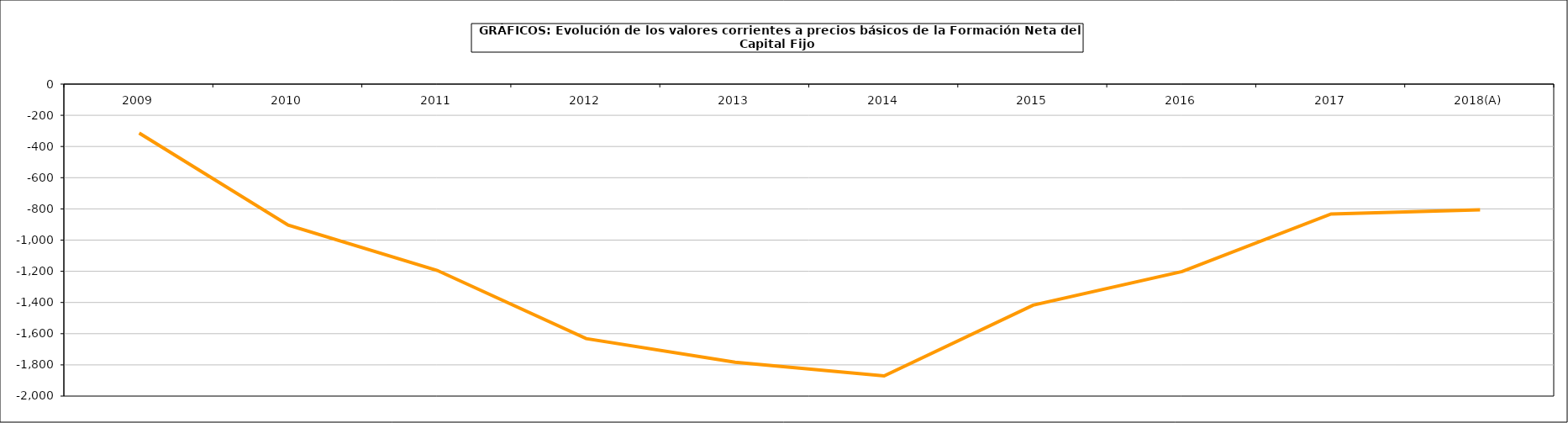
| Category | Formación neta del capital fijo |
|---|---|
| 2009 | -313.729 |
| 2010 | -903.574 |
| 2011 | -1194.236 |
| 2012 | -1631.605 |
| 2013 | -1783.499 |
| 2014 | -1870.615 |
| 2015 | -1417.245 |
| 2016 | -1201.233 |
| 2017 | -832.33 |
| 2018(A) | -806.153 |